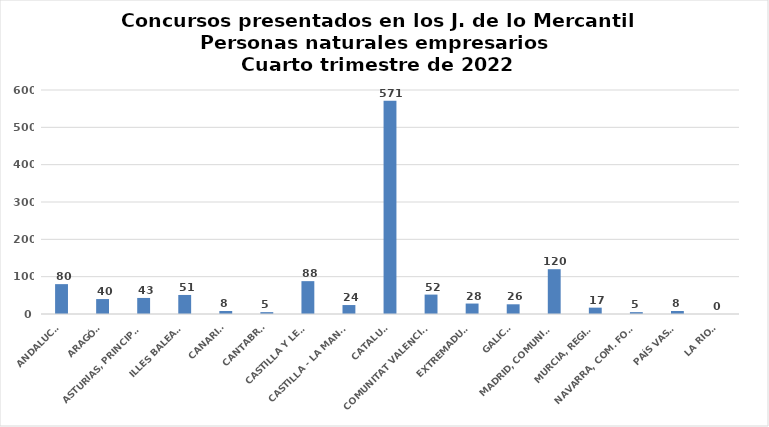
| Category | Series 0 |
|---|---|
| ANDALUCÍA | 80 |
| ARAGÓN | 40 |
| ASTURIAS, PRINCIPADO | 43 |
| ILLES BALEARS | 51 |
| CANARIAS | 8 |
| CANTABRIA | 5 |
| CASTILLA Y LEÓN | 88 |
| CASTILLA - LA MANCHA | 24 |
| CATALUÑA | 571 |
| COMUNITAT VALENCIANA | 52 |
| EXTREMADURA | 28 |
| GALICIA | 26 |
| MADRID, COMUNIDAD | 120 |
| MURCIA, REGIÓN | 17 |
| NAVARRA, COM. FORAL | 5 |
| PAÍS VASCO | 8 |
| LA RIOJA | 0 |